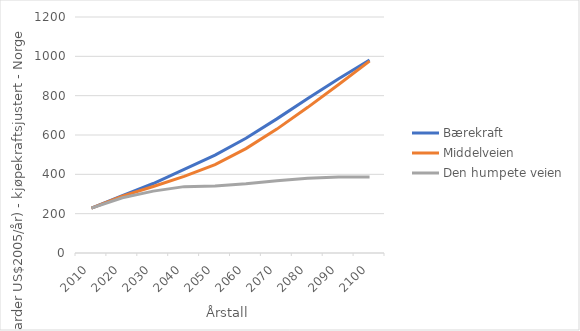
| Category | Bærekraft | Middelveien | Den humpete veien |
|---|---|---|---|
| 2010.0 | 228.255 | 228.255 | 228.255 |
| 2020.0 | 291.04 | 288.961 | 280.912 |
| 2030.0 | 353.349 | 337.963 | 314.712 |
| 2040.0 | 425.168 | 389.559 | 337.46 |
| 2050.0 | 497.539 | 449.452 | 340.923 |
| 2060.0 | 583.437 | 530.901 | 351.7 |
| 2070.0 | 682.022 | 629.908 | 367.447 |
| 2080.0 | 785.557 | 740.62 | 379.688 |
| 2090.0 | 886.14 | 857.001 | 385.89 |
| 2100.0 | 981.062 | 975.711 | 386.698 |